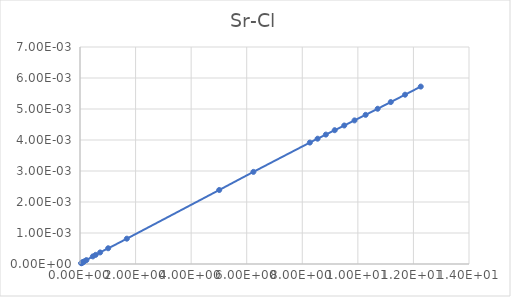
| Category | Series 0 |
|---|---|
| 0.045798 | 0 |
| 0.050886 | 0 |
| 0.057258 | 0 |
| 0.065456 | 0 |
| 0.076369 | 0 |
| 0.091683 | 0 |
| 0.11463 | 0 |
| 0.15298 | 0 |
| 0.2297 | 0 |
| 0.46159 | 0 |
| 0.56399 | 0 |
| 0.72477 | 0 |
| 1.0138 | 0.001 |
| 1.6863 | 0.001 |
| 5.0106 | 0.002 |
| 6.241 | 0.003 |
| 8.2722 | 0.004 |
| 8.5505 | 0.004 |
| 8.8482 | 0.004 |
| 9.1674 | 0.004 |
| 9.5104 | 0.004 |
| 9.8801 | 0.005 |
| 10.28 | 0.005 |
| 10.713 | 0.005 |
| 11.185 | 0.005 |
| 11.699 | 0.005 |
| 12.264 | 0.006 |